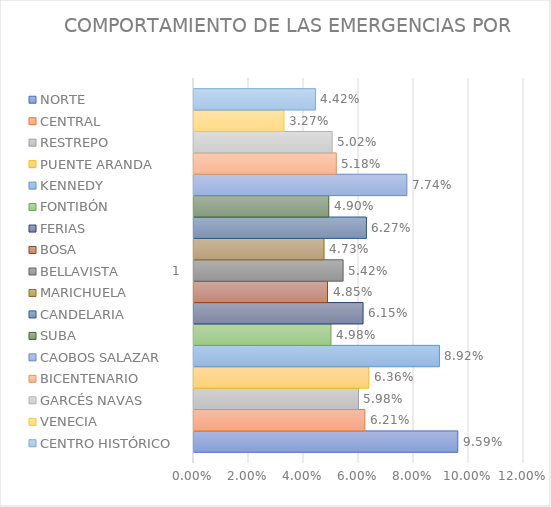
| Category | NORTE | CENTRAL | RESTREPO | PUENTE ARANDA | KENNEDY | FONTIBÓN | FERIAS | BOSA | BELLAVISTA | MARICHUELA | CANDELARIA | SUBA | CAOBOS SALAZAR | BICENTENARIO | GARCÉS NAVAS | VENECIA | CENTRO HISTÓRICO |
|---|---|---|---|---|---|---|---|---|---|---|---|---|---|---|---|---|---|
| 0 | 0.096 | 0.062 | 0.06 | 0.064 | 0.089 | 0.05 | 0.061 | 0.049 | 0.054 | 0.047 | 0.063 | 0.049 | 0.077 | 0.052 | 0.05 | 0.033 | 0.044 |